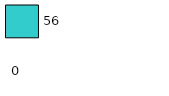
| Category | Series 0 | Series 1 |
|---|---|---|
| 0 | 0 | 56 |